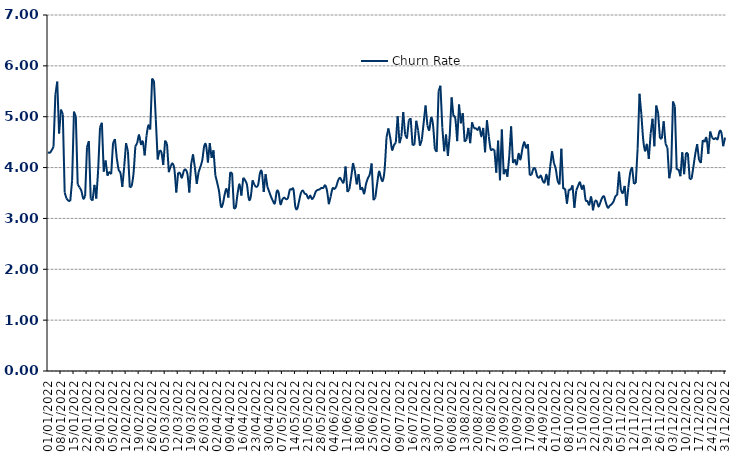
| Category | Churn Rate |
|---|---|
| 01/01/2022 | 4.3 |
| 02/01/2022 | 4.29 |
| 03/01/2022 | 4.34 |
| 04/01/2022 | 4.41 |
| 05/01/2022 | 5.43 |
| 06/01/2022 | 5.69 |
| 07/01/2022 | 4.67 |
| 08/01/2022 | 5.14 |
| 09/01/2022 | 5.05 |
| 10/01/2022 | 3.51 |
| 11/01/2022 | 3.39 |
| 12/01/2022 | 3.35 |
| 13/01/2022 | 3.34 |
| 14/01/2022 | 3.75 |
| 15/01/2022 | 5.1 |
| 16/01/2022 | 5 |
| 17/01/2022 | 3.67 |
| 18/01/2022 | 3.61 |
| 19/01/2022 | 3.54 |
| 20/01/2022 | 3.39 |
| 21/01/2022 | 3.44 |
| 22/01/2022 | 4.4 |
| 23/01/2022 | 4.52 |
| 24/01/2022 | 3.39 |
| 25/01/2022 | 3.35 |
| 26/01/2022 | 3.66 |
| 27/01/2022 | 3.39 |
| 28/01/2022 | 3.95 |
| 29/01/2022 | 4.79 |
| 30/01/2022 | 4.88 |
| 31/01/2022 | 3.92 |
| 01/02/2022 | 4.14 |
| 02/02/2022 | 3.84 |
| 03/02/2022 | 3.91 |
| 04/02/2022 | 3.87 |
| 05/02/2022 | 4.48 |
| 06/02/2022 | 4.56 |
| 07/02/2022 | 4.19 |
| 08/02/2022 | 3.96 |
| 09/02/2022 | 3.89 |
| 10/02/2022 | 3.62 |
| 11/02/2022 | 4.02 |
| 12/02/2022 | 4.48 |
| 13/02/2022 | 4.32 |
| 14/02/2022 | 3.61 |
| 15/02/2022 | 3.63 |
| 16/02/2022 | 3.88 |
| 17/02/2022 | 4.42 |
| 18/02/2022 | 4.48 |
| 19/02/2022 | 4.64 |
| 20/02/2022 | 4.46 |
| 21/02/2022 | 4.51 |
| 22/02/2022 | 4.24 |
| 23/02/2022 | 4.63 |
| 24/02/2022 | 4.83 |
| 25/02/2022 | 4.75 |
| 26/02/2022 | 5.75 |
| 27/02/2022 | 5.7 |
| 28/02/2022 | 4.94 |
| 01/03/2022 | 4.16 |
| 02/03/2022 | 4.34 |
| 03/03/2022 | 4.3 |
| 04/03/2022 | 4.05 |
| 05/03/2022 | 4.53 |
| 06/03/2022 | 4.47 |
| 07/03/2022 | 3.91 |
| 08/03/2022 | 4.03 |
| 09/03/2022 | 4.08 |
| 10/03/2022 | 3.96 |
| 11/03/2022 | 3.51 |
| 12/03/2022 | 3.9 |
| 13/03/2022 | 3.89 |
| 14/03/2022 | 3.8 |
| 15/03/2022 | 3.93 |
| 16/03/2022 | 3.96 |
| 17/03/2022 | 3.87 |
| 18/03/2022 | 3.51 |
| 19/03/2022 | 4.07 |
| 20/03/2022 | 4.26 |
| 21/03/2022 | 4 |
| 22/03/2022 | 3.68 |
| 23/03/2022 | 3.91 |
| 24/03/2022 | 4.02 |
| 25/03/2022 | 4.15 |
| 26/03/2022 | 4.42 |
| 27/03/2022 | 4.44 |
| 28/03/2022 | 4.1 |
| 29/03/2022 | 4.48 |
| 30/03/2022 | 4.19 |
| 31/03/2022 | 4.34 |
| 01/04/2022 | 3.85 |
| 02/04/2022 | 3.7 |
| 03/04/2022 | 3.53 |
| 04/04/2022 | 3.24 |
| 05/04/2022 | 3.28 |
| 06/04/2022 | 3.47 |
| 07/04/2022 | 3.58 |
| 08/04/2022 | 3.41 |
| 09/04/2022 | 3.91 |
| 10/04/2022 | 3.89 |
| 11/04/2022 | 3.19 |
| 12/04/2022 | 3.21 |
| 13/04/2022 | 3.5 |
| 14/04/2022 | 3.67 |
| 15/04/2022 | 3.45 |
| 16/04/2022 | 3.8 |
| 17/04/2022 | 3.75 |
| 18/04/2022 | 3.66 |
| 19/04/2022 | 3.38 |
| 20/04/2022 | 3.42 |
| 21/04/2022 | 3.75 |
| 22/04/2022 | 3.66 |
| 23/04/2022 | 3.62 |
| 24/04/2022 | 3.66 |
| 25/04/2022 | 3.89 |
| 26/04/2022 | 3.91 |
| 27/04/2022 | 3.52 |
| 28/04/2022 | 3.87 |
| 29/04/2022 | 3.62 |
| 30/04/2022 | 3.52 |
| 01/05/2022 | 3.42 |
| 02/05/2022 | 3.34 |
| 03/05/2022 | 3.3 |
| 04/05/2022 | 3.53 |
| 05/05/2022 | 3.51 |
| 06/05/2022 | 3.28 |
| 07/05/2022 | 3.37 |
| 08/05/2022 | 3.41 |
| 09/05/2022 | 3.38 |
| 10/05/2022 | 3.4 |
| 11/05/2022 | 3.56 |
| 12/05/2022 | 3.57 |
| 13/05/2022 | 3.57 |
| 14/05/2022 | 3.23 |
| 15/05/2022 | 3.19 |
| 16/05/2022 | 3.34 |
| 17/05/2022 | 3.5 |
| 18/05/2022 | 3.55 |
| 19/05/2022 | 3.49 |
| 20/05/2022 | 3.47 |
| 21/05/2022 | 3.39 |
| 22/05/2022 | 3.45 |
| 23/05/2022 | 3.38 |
| 24/05/2022 | 3.43 |
| 25/05/2022 | 3.53 |
| 26/05/2022 | 3.56 |
| 27/05/2022 | 3.57 |
| 28/05/2022 | 3.6 |
| 29/05/2022 | 3.6 |
| 30/05/2022 | 3.65 |
| 31/05/2022 | 3.55 |
| 01/06/2022 | 3.28 |
| 02/06/2022 | 3.43 |
| 03/06/2022 | 3.59 |
| 04/06/2022 | 3.58 |
| 05/06/2022 | 3.63 |
| 06/06/2022 | 3.75 |
| 07/06/2022 | 3.8 |
| 08/06/2022 | 3.74 |
| 09/06/2022 | 3.72 |
| 10/06/2022 | 4.02 |
| 11/06/2022 | 3.52 |
| 12/06/2022 | 3.57 |
| 13/06/2022 | 3.81 |
| 14/06/2022 | 4.09 |
| 15/06/2022 | 3.93 |
| 16/06/2022 | 3.67 |
| 17/06/2022 | 3.87 |
| 18/06/2022 | 3.56 |
| 19/06/2022 | 3.6 |
| 20/06/2022 | 3.49 |
| 21/06/2022 | 3.68 |
| 22/06/2022 | 3.79 |
| 23/06/2022 | 3.87 |
| 24/06/2022 | 4.08 |
| 25/06/2022 | 3.36 |
| 26/06/2022 | 3.41 |
| 27/06/2022 | 3.69 |
| 28/06/2022 | 3.92 |
| 29/06/2022 | 3.8 |
| 30/06/2022 | 3.74 |
| 01/07/2022 | 3.97 |
| 02/07/2022 | 4.59 |
| 03/07/2022 | 4.77 |
| 04/07/2022 | 4.59 |
| 05/07/2022 | 4.35 |
| 06/07/2022 | 4.44 |
| 07/07/2022 | 4.49 |
| 08/07/2022 | 5.01 |
| 09/07/2022 | 4.48 |
| 10/07/2022 | 4.61 |
| 11/07/2022 | 5.09 |
| 12/07/2022 | 4.65 |
| 13/07/2022 | 4.57 |
| 14/07/2022 | 4.93 |
| 15/07/2022 | 4.97 |
| 16/07/2022 | 4.44 |
| 17/07/2022 | 4.45 |
| 18/07/2022 | 4.92 |
| 19/07/2022 | 4.73 |
| 20/07/2022 | 4.43 |
| 21/07/2022 | 4.55 |
| 22/07/2022 | 4.89 |
| 23/07/2022 | 5.22 |
| 24/07/2022 | 4.83 |
| 25/07/2022 | 4.74 |
| 26/07/2022 | 4.98 |
| 27/07/2022 | 4.84 |
| 28/07/2022 | 4.36 |
| 29/07/2022 | 4.31 |
| 30/07/2022 | 5.5 |
| 31/07/2022 | 5.61 |
| 01/08/2022 | 4.79 |
| 02/08/2022 | 4.32 |
| 03/08/2022 | 4.65 |
| 04/08/2022 | 4.23 |
| 05/08/2022 | 4.64 |
| 06/08/2022 | 5.38 |
| 07/08/2022 | 5.01 |
| 08/08/2022 | 4.96 |
| 09/08/2022 | 4.52 |
| 10/08/2022 | 5.24 |
| 11/08/2022 | 4.87 |
| 12/08/2022 | 5.07 |
| 13/08/2022 | 4.51 |
| 14/08/2022 | 4.55 |
| 15/08/2022 | 4.78 |
| 16/08/2022 | 4.48 |
| 17/08/2022 | 4.89 |
| 18/08/2022 | 4.77 |
| 19/08/2022 | 4.77 |
| 20/08/2022 | 4.74 |
| 21/08/2022 | 4.79 |
| 22/08/2022 | 4.61 |
| 23/08/2022 | 4.78 |
| 24/08/2022 | 4.3 |
| 25/08/2022 | 4.93 |
| 26/08/2022 | 4.61 |
| 27/08/2022 | 4.36 |
| 28/08/2022 | 4.36 |
| 29/08/2022 | 4.35 |
| 30/08/2022 | 3.9 |
| 31/08/2022 | 4.53 |
| 01/09/2022 | 3.75 |
| 02/09/2022 | 4.75 |
| 03/09/2022 | 3.87 |
| 04/09/2022 | 3.97 |
| 05/09/2022 | 3.82 |
| 06/09/2022 | 4.23 |
| 07/09/2022 | 4.81 |
| 08/09/2022 | 4.09 |
| 09/09/2022 | 4.16 |
| 10/09/2022 | 4.06 |
| 11/09/2022 | 4.27 |
| 12/09/2022 | 4.16 |
| 13/09/2022 | 4.36 |
| 14/09/2022 | 4.5 |
| 15/09/2022 | 4.39 |
| 16/09/2022 | 4.46 |
| 17/09/2022 | 3.85 |
| 18/09/2022 | 3.86 |
| 19/09/2022 | 3.98 |
| 20/09/2022 | 3.97 |
| 21/09/2022 | 3.83 |
| 22/09/2022 | 3.8 |
| 23/09/2022 | 3.84 |
| 24/09/2022 | 3.74 |
| 25/09/2022 | 3.71 |
| 26/09/2022 | 3.86 |
| 27/09/2022 | 3.65 |
| 28/09/2022 | 4.02 |
| 29/09/2022 | 4.32 |
| 30/09/2022 | 4.09 |
| 01/10/2022 | 3.97 |
| 02/10/2022 | 3.74 |
| 03/10/2022 | 3.67 |
| 04/10/2022 | 4.37 |
| 05/10/2022 | 3.58 |
| 06/10/2022 | 3.59 |
| 07/10/2022 | 3.29 |
| 08/10/2022 | 3.57 |
| 09/10/2022 | 3.57 |
| 10/10/2022 | 3.65 |
| 11/10/2022 | 3.21 |
| 12/10/2022 | 3.55 |
| 13/10/2022 | 3.64 |
| 14/10/2022 | 3.71 |
| 15/10/2022 | 3.58 |
| 16/10/2022 | 3.64 |
| 17/10/2022 | 3.37 |
| 18/10/2022 | 3.34 |
| 19/10/2022 | 3.27 |
| 20/10/2022 | 3.42 |
| 21/10/2022 | 3.16 |
| 22/10/2022 | 3.35 |
| 23/10/2022 | 3.34 |
| 24/10/2022 | 3.23 |
| 25/10/2022 | 3.32 |
| 26/10/2022 | 3.41 |
| 27/10/2022 | 3.43 |
| 28/10/2022 | 3.3 |
| 29/10/2022 | 3.21 |
| 30/10/2022 | 3.25 |
| 31/10/2022 | 3.28 |
| 01/11/2022 | 3.33 |
| 02/11/2022 | 3.43 |
| 03/11/2022 | 3.46 |
| 04/11/2022 | 3.92 |
| 05/11/2022 | 3.56 |
| 06/11/2022 | 3.5 |
| 07/11/2022 | 3.64 |
| 08/11/2022 | 3.25 |
| 09/11/2022 | 3.61 |
| 10/11/2022 | 3.9 |
| 11/11/2022 | 4.01 |
| 12/11/2022 | 3.68 |
| 13/11/2022 | 3.7 |
| 14/11/2022 | 4.38 |
| 15/11/2022 | 5.45 |
| 16/11/2022 | 5.05 |
| 17/11/2022 | 4.55 |
| 18/11/2022 | 4.33 |
| 19/11/2022 | 4.45 |
| 20/11/2022 | 4.17 |
| 21/11/2022 | 4.67 |
| 22/11/2022 | 4.96 |
| 23/11/2022 | 4.42 |
| 24/11/2022 | 5.22 |
| 25/11/2022 | 5.07 |
| 26/11/2022 | 4.57 |
| 27/11/2022 | 4.57 |
| 28/11/2022 | 4.91 |
| 29/11/2022 | 4.47 |
| 30/11/2022 | 4.39 |
| 01/12/2022 | 3.79 |
| 02/12/2022 | 3.97 |
| 03/12/2022 | 5.3 |
| 04/12/2022 | 5.2 |
| 05/12/2022 | 3.96 |
| 06/12/2022 | 3.97 |
| 07/12/2022 | 3.83 |
| 08/12/2022 | 4.3 |
| 09/12/2022 | 3.87 |
| 10/12/2022 | 4.29 |
| 11/12/2022 | 4.28 |
| 12/12/2022 | 3.77 |
| 13/12/2022 | 3.78 |
| 14/12/2022 | 4.02 |
| 15/12/2022 | 4.27 |
| 16/12/2022 | 4.46 |
| 17/12/2022 | 4.15 |
| 18/12/2022 | 4.09 |
| 19/12/2022 | 4.54 |
| 20/12/2022 | 4.5 |
| 21/12/2022 | 4.58 |
| 22/12/2022 | 4.27 |
| 23/12/2022 | 4.71 |
| 24/12/2022 | 4.59 |
| 25/12/2022 | 4.56 |
| 26/12/2022 | 4.58 |
| 27/12/2022 | 4.56 |
| 28/12/2022 | 4.71 |
| 29/12/2022 | 4.69 |
| 30/12/2022 | 4.42 |
| 31/12/2022 | 4.59 |